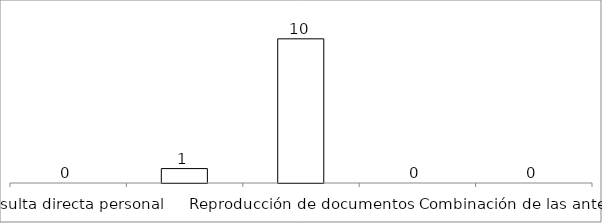
| Category | Series 0 |
|---|---|
| Consulta directa personal | 0 |
| Consulta directa electrónica | 1 |
| Reproducción de documentos | 10 |
| Elaboración de informes | 0 |
| Combinación de las anteriores | 0 |